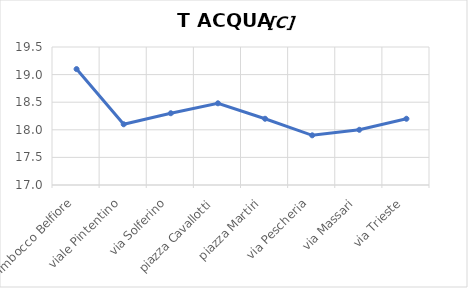
| Category | T ACQUA [C] |
|---|---|
| Imbocco Belfiore | 19.1 |
| viale Pintentino | 18.1 |
| via Solferino | 18.3 |
| piazza Cavallotti | 18.48 |
| piazza Martiri | 18.2 |
| via Pescheria | 17.9 |
| via Massari | 18 |
| via Trieste | 18.2 |